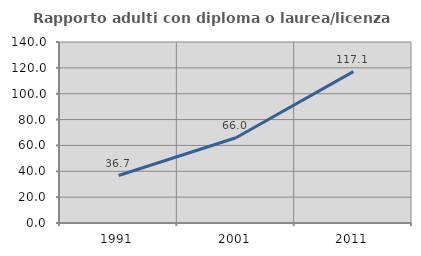
| Category | Rapporto adulti con diploma o laurea/licenza media  |
|---|---|
| 1991.0 | 36.723 |
| 2001.0 | 65.972 |
| 2011.0 | 117.114 |